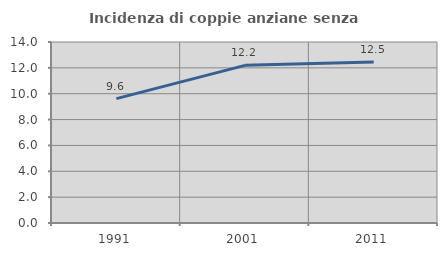
| Category | Incidenza di coppie anziane senza figli  |
|---|---|
| 1991.0 | 9.62 |
| 2001.0 | 12.192 |
| 2011.0 | 12.452 |